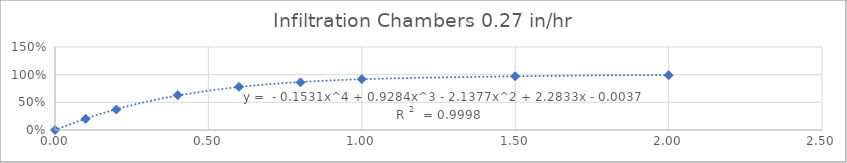
| Category | Series 0 |
|---|---|
| 0.0 | 0 |
| 0.1 | 0.2 |
| 0.2 | 0.37 |
| 0.4 | 0.63 |
| 0.6 | 0.78 |
| 0.8 | 0.86 |
| 1.0 | 0.92 |
| 1.5 | 0.97 |
| 2.0 | 0.99 |